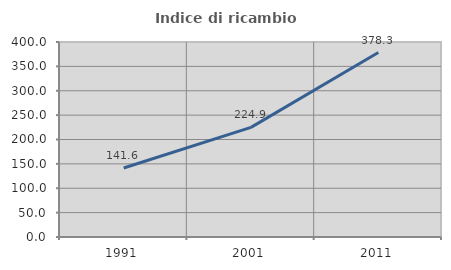
| Category | Indice di ricambio occupazionale  |
|---|---|
| 1991.0 | 141.557 |
| 2001.0 | 224.918 |
| 2011.0 | 378.336 |